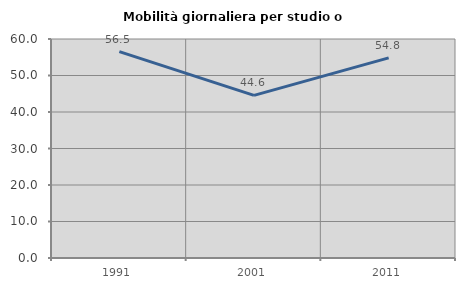
| Category | Mobilità giornaliera per studio o lavoro |
|---|---|
| 1991.0 | 56.535 |
| 2001.0 | 44.561 |
| 2011.0 | 54.837 |